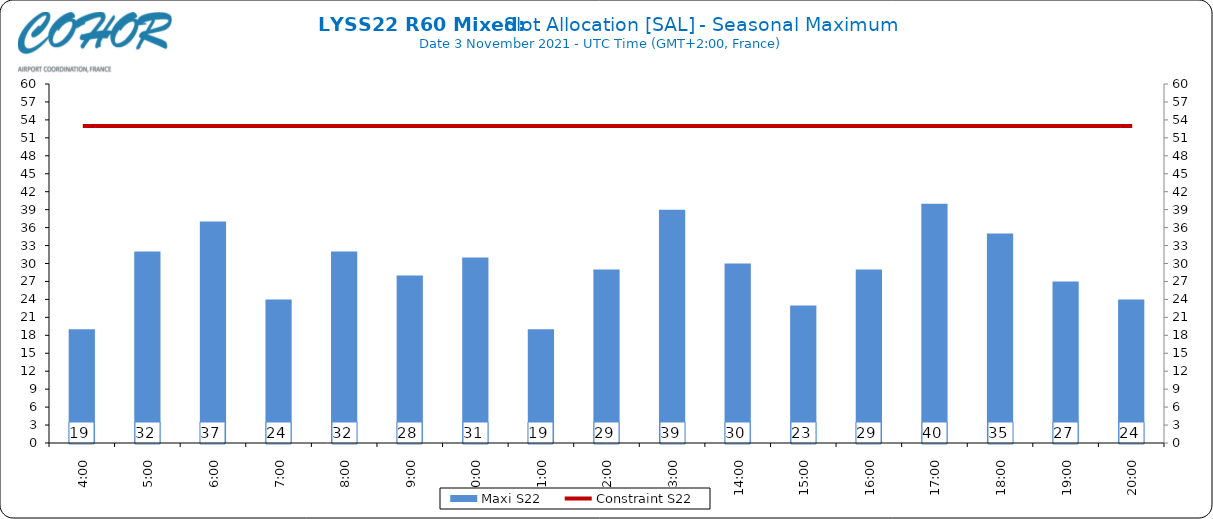
| Category | Maxi S22 |
|---|---|
| 4:00 | 19 |
| 5:00 | 32 |
| 6:00 | 37 |
| 7:00 | 24 |
| 8:00 | 32 |
| 9:00 | 28 |
| 10:00 | 31 |
| 11:00 | 19 |
| 12:00 | 29 |
| 13:00 | 39 |
| 14:00 | 30 |
| 15:00 | 23 |
| 16:00 | 29 |
| 17:00 | 40 |
| 18:00 | 35 |
| 19:00 | 27 |
| 20:00 | 24 |